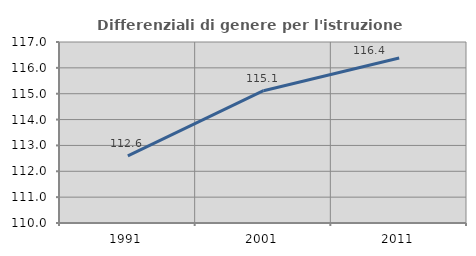
| Category | Differenziali di genere per l'istruzione superiore |
|---|---|
| 1991.0 | 112.598 |
| 2001.0 | 115.116 |
| 2011.0 | 116.382 |